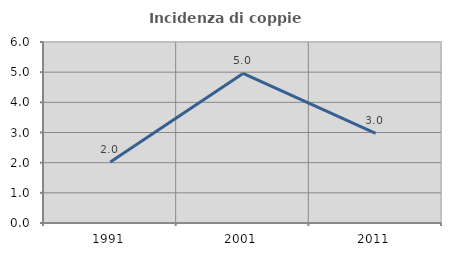
| Category | Incidenza di coppie miste |
|---|---|
| 1991.0 | 2.02 |
| 2001.0 | 4.959 |
| 2011.0 | 2.97 |